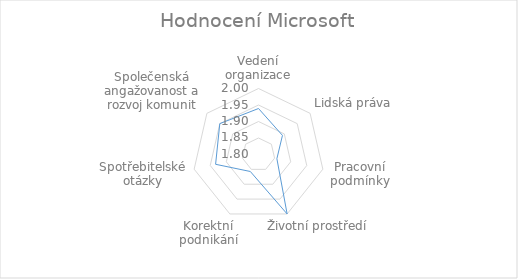
| Category | Microsoft |
|---|---|
| Vedení organizace | 1.939 |
| Lidská práva | 1.893 |
| Pracovní podmínky | 1.857 |
| Životní prostředí | 2 |
| Korektní podnikání | 1.857 |
| Spotřebitelské otázky | 1.933 |
| Společenská angažovanost a rozvoj komunit | 1.95 |